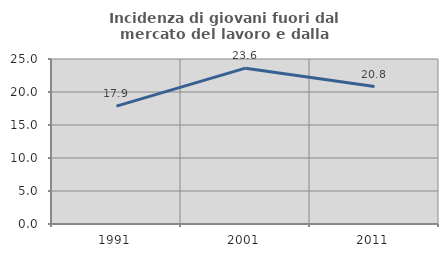
| Category | Incidenza di giovani fuori dal mercato del lavoro e dalla formazione  |
|---|---|
| 1991.0 | 17.853 |
| 2001.0 | 23.613 |
| 2011.0 | 20.824 |